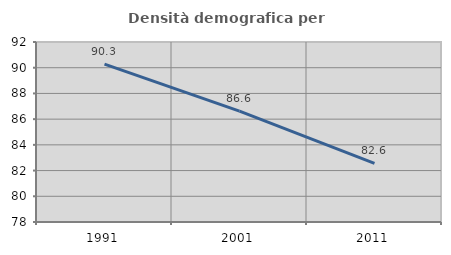
| Category | Densità demografica |
|---|---|
| 1991.0 | 90.284 |
| 2001.0 | 86.624 |
| 2011.0 | 82.566 |